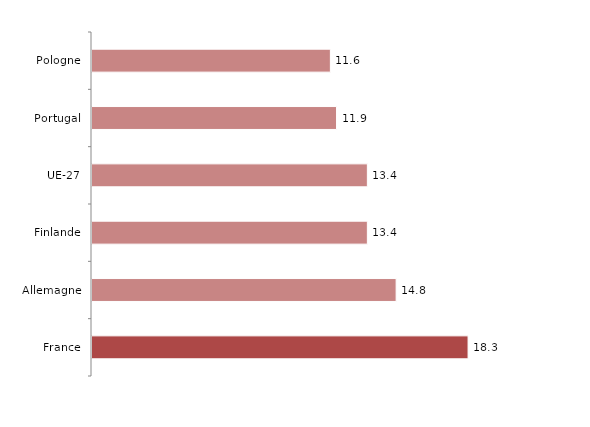
| Category | Series 0 |
|---|---|
| France | 18.3 |
| Allemagne | 14.8 |
| Finlande | 13.4 |
| UE-27 | 13.4 |
| Portugal | 11.9 |
| Pologne | 11.6 |